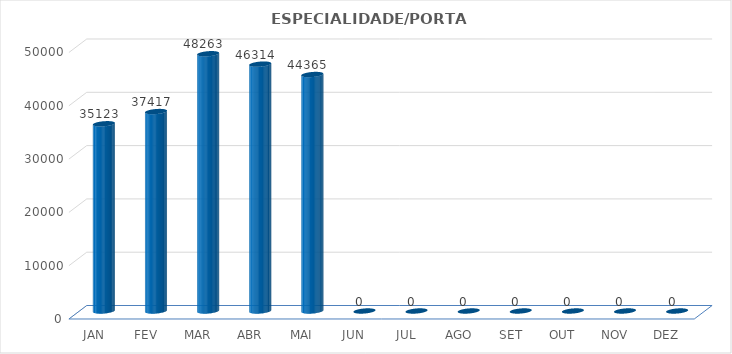
| Category | Series 0 |
|---|---|
| JAN | 35123 |
| FEV | 37417 |
| MAR | 48263 |
| ABR | 46314 |
| MAI | 44365 |
| JUN | 0 |
| JUL | 0 |
| AGO | 0 |
| SET | 0 |
| OUT | 0 |
| NOV | 0 |
| DEZ | 0 |